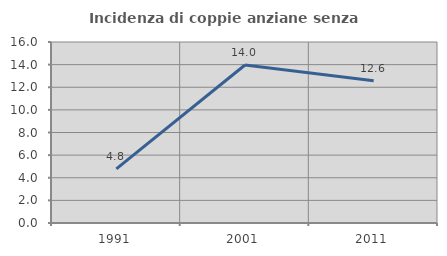
| Category | Incidenza di coppie anziane senza figli  |
|---|---|
| 1991.0 | 4.787 |
| 2001.0 | 13.966 |
| 2011.0 | 12.565 |